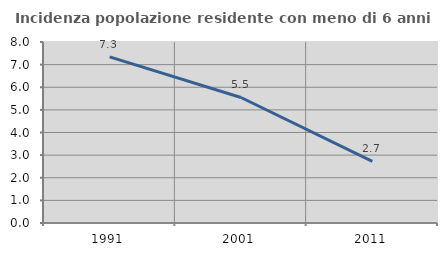
| Category | Incidenza popolazione residente con meno di 6 anni |
|---|---|
| 1991.0 | 7.345 |
| 2001.0 | 5.547 |
| 2011.0 | 2.726 |